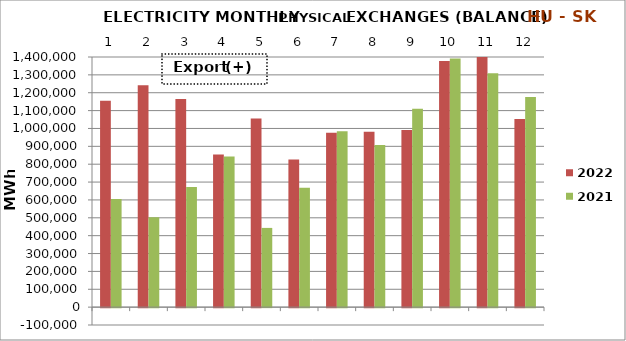
| Category | 2022 | 2021 |
|---|---|---|
| 0 | 1154593.08 | 605396.322 |
| 1 | 1241919.946 | 502817.058 |
| 2 | 1165323.234 | 671978.265 |
| 3 | 854022.263 | 842403.002 |
| 4 | 1055166.712 | 443421.422 |
| 5 | 826082.203 | 667716.722 |
| 6 | 976087.861 | 984257.38 |
| 7 | 981687.692 | 907186.703 |
| 8 | 991996.086 | 1110898.241 |
| 9 | 1378302.754 | 1392279.848 |
| 10 | 1405605.898 | 1309247.205 |
| 11 | 1052537.086 | 1175627.019 |